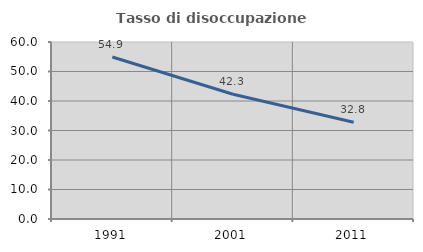
| Category | Tasso di disoccupazione giovanile  |
|---|---|
| 1991.0 | 54.908 |
| 2001.0 | 42.289 |
| 2011.0 | 32.804 |